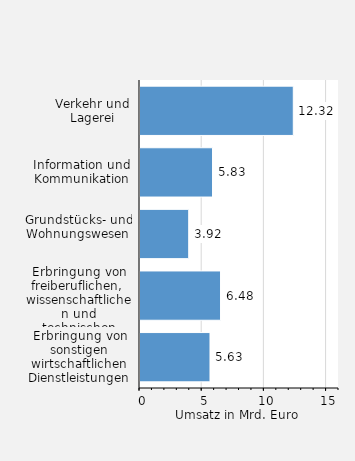
| Category | Umsatz in Mrd. Euro |
|---|---|
| Verkehr und Lagerei | 12.325 |
| Information und Kommunikation | 5.83 |
| Grundstücks- und Wohnungswesen  | 3.916 |
| Erbringung von freiberuflichen, 
wissenschaftlichen und technischen Dienstleistungen | 6.476 |
| Erbringung von sonstigen wirtschaftlichen Dienstleistungen | 5.627 |